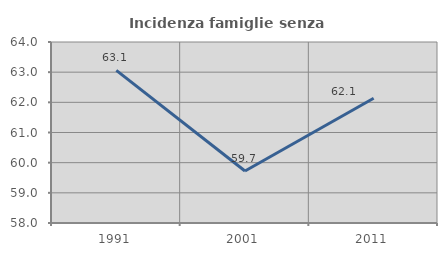
| Category | Incidenza famiglie senza nuclei |
|---|---|
| 1991.0 | 63.061 |
| 2001.0 | 59.722 |
| 2011.0 | 62.134 |